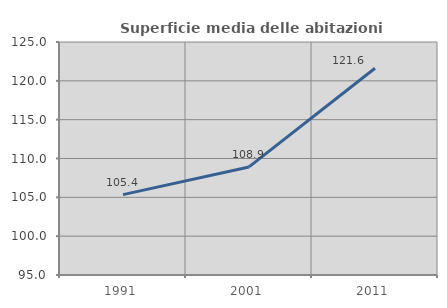
| Category | Superficie media delle abitazioni occupate |
|---|---|
| 1991.0 | 105.351 |
| 2001.0 | 108.917 |
| 2011.0 | 121.623 |